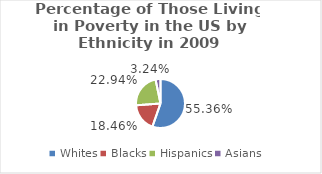
| Category | Percent in Poverty |
|---|---|
| Whites | 0.554 |
| Blacks | 0.185 |
| Hispanics | 0.229 |
| Asians | 0.032 |